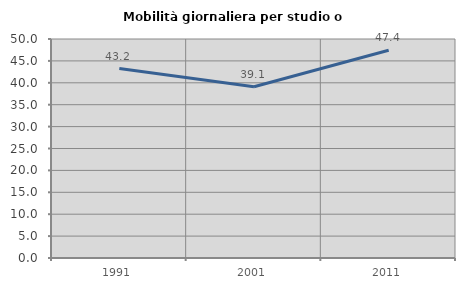
| Category | Mobilità giornaliera per studio o lavoro |
|---|---|
| 1991.0 | 43.24 |
| 2001.0 | 39.09 |
| 2011.0 | 47.418 |